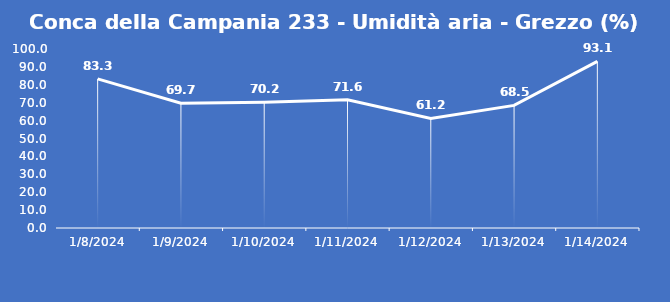
| Category | Conca della Campania 233 - Umidità aria - Grezzo (%) |
|---|---|
| 1/8/24 | 83.3 |
| 1/9/24 | 69.7 |
| 1/10/24 | 70.2 |
| 1/11/24 | 71.6 |
| 1/12/24 | 61.2 |
| 1/13/24 | 68.5 |
| 1/14/24 | 93.1 |